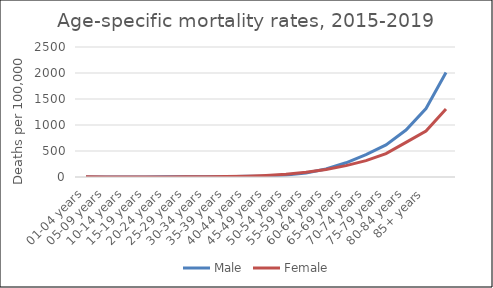
| Category | Male | Female |
|---|---|---|
| 01-04 years | 0 | 3.41 |
| 05-09 years | 1.72 | 1.44 |
| 10-14 years | 1.81 | 2.37 |
| 15-19 years | 2.16 | 1.78 |
| 20-24 years | 4.17 | 2.1 |
| 25-29 years | 5.26 | 2.8 |
| 30-34 years | 4.74 | 4.22 |
| 35-39 years | 6.28 | 7.59 |
| 40-44 years | 13.37 | 15.08 |
| 45-49 years | 19.36 | 29.03 |
| 50-54 years | 39.65 | 50.81 |
| 55-59 years | 76.13 | 90.17 |
| 60-64 years | 155.16 | 144.69 |
| 65-69 years | 273.59 | 218.33 |
| 70-74 years | 431.47 | 314.82 |
| 75-79 years | 615.84 | 449.42 |
| 80-84 years | 902.88 | 665.26 |
| 85+ years | 1315.67 | 885.1 |